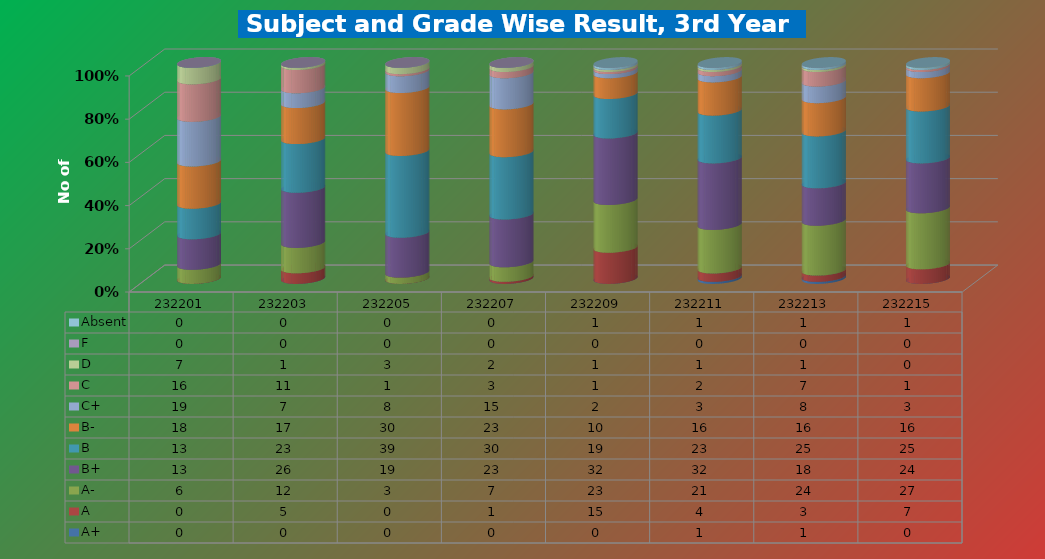
| Category | A+ | A | A- | B+ | B | B- | C+ | C | D | F | Absent |
|---|---|---|---|---|---|---|---|---|---|---|---|
| 232201.0 | 0 | 0 | 6 | 13 | 13 | 18 | 19 | 16 | 7 | 0 | 0 |
| 232203.0 | 0 | 5 | 12 | 26 | 23 | 17 | 7 | 11 | 1 | 0 | 0 |
| 232205.0 | 0 | 0 | 3 | 19 | 39 | 30 | 8 | 1 | 3 | 0 | 0 |
| 232207.0 | 0 | 1 | 7 | 23 | 30 | 23 | 15 | 3 | 2 | 0 | 0 |
| 232209.0 | 0 | 15 | 23 | 32 | 19 | 10 | 2 | 1 | 1 | 0 | 1 |
| 232211.0 | 1 | 4 | 21 | 32 | 23 | 16 | 3 | 2 | 1 | 0 | 1 |
| 232213.0 | 1 | 3 | 24 | 18 | 25 | 16 | 8 | 7 | 1 | 0 | 1 |
| 232215.0 | 0 | 7 | 27 | 24 | 25 | 16 | 3 | 1 | 0 | 0 | 1 |